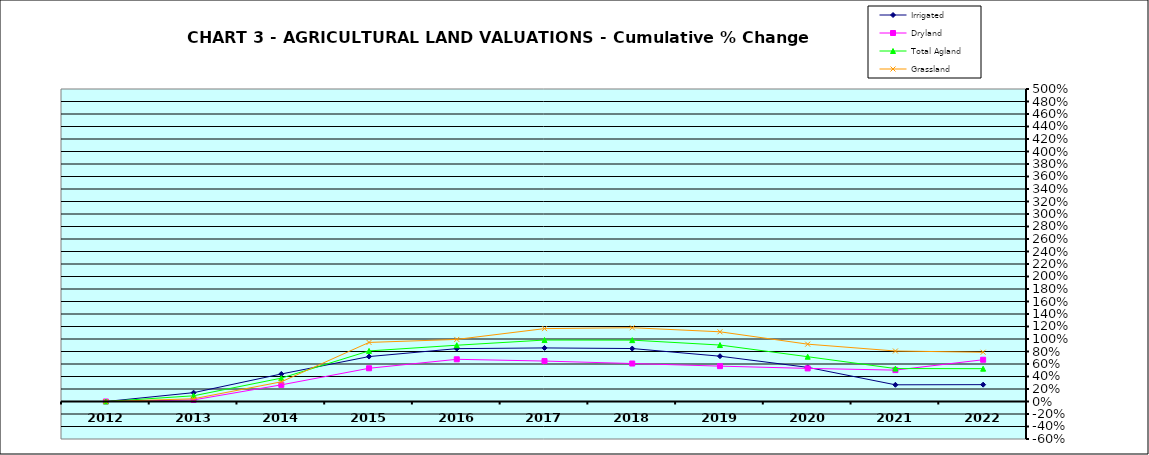
| Category | Irrigated | Dryland | Total Agland | Grassland |
|---|---|---|---|---|
| 2012.0 | 0 | 0 | 0 | 0 |
| 2013.0 | 0.141 | 0.025 | 0.091 | 0.044 |
| 2014.0 | 0.44 | 0.266 | 0.374 | 0.315 |
| 2015.0 | 0.719 | 0.532 | 0.809 | 0.945 |
| 2016.0 | 0.846 | 0.675 | 0.9 | 0.993 |
| 2017.0 | 0.857 | 0.647 | 0.983 | 1.166 |
| 2018.0 | 0.847 | 0.608 | 0.982 | 1.18 |
| 2019.0 | 0.725 | 0.566 | 0.903 | 1.115 |
| 2020.0 | 0.546 | 0.53 | 0.717 | 0.917 |
| 2021.0 | 0.267 | 0.502 | 0.527 | 0.808 |
| 2022.0 | 0.27 | 0.668 | 0.525 | 0.788 |